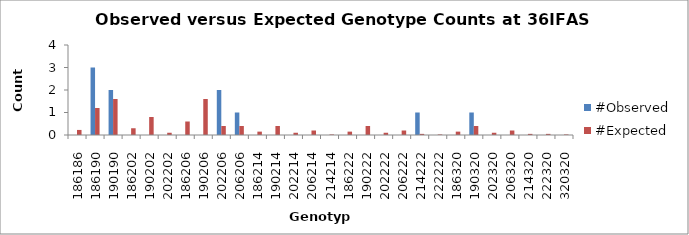
| Category | #Observed | #Expected |
|---|---|---|
| 186186.0 | 0 | 0.225 |
| 186190.0 | 3 | 1.2 |
| 190190.0 | 2 | 1.6 |
| 186202.0 | 0 | 0.3 |
| 190202.0 | 0 | 0.8 |
| 202202.0 | 0 | 0.1 |
| 186206.0 | 0 | 0.6 |
| 190206.0 | 0 | 1.6 |
| 202206.0 | 2 | 0.4 |
| 206206.0 | 1 | 0.4 |
| 186214.0 | 0 | 0.15 |
| 190214.0 | 0 | 0.4 |
| 202214.0 | 0 | 0.1 |
| 206214.0 | 0 | 0.2 |
| 214214.0 | 0 | 0.025 |
| 186222.0 | 0 | 0.15 |
| 190222.0 | 0 | 0.4 |
| 202222.0 | 0 | 0.1 |
| 206222.0 | 0 | 0.2 |
| 214222.0 | 1 | 0.05 |
| 222222.0 | 0 | 0.025 |
| 186320.0 | 0 | 0.15 |
| 190320.0 | 1 | 0.4 |
| 202320.0 | 0 | 0.1 |
| 206320.0 | 0 | 0.2 |
| 214320.0 | 0 | 0.05 |
| 222320.0 | 0 | 0.05 |
| 320320.0 | 0 | 0.025 |